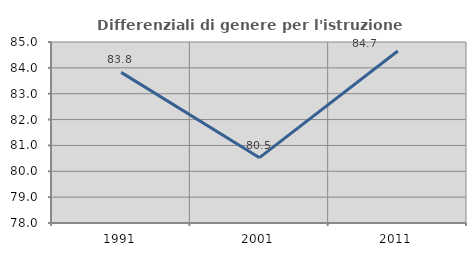
| Category | Differenziali di genere per l'istruzione superiore |
|---|---|
| 1991.0 | 83.825 |
| 2001.0 | 80.526 |
| 2011.0 | 84.654 |